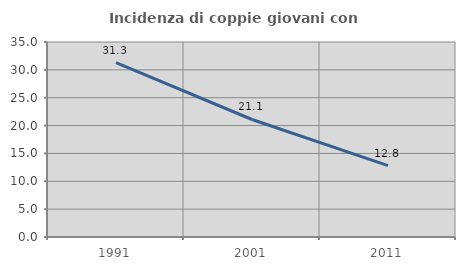
| Category | Incidenza di coppie giovani con figli |
|---|---|
| 1991.0 | 31.281 |
| 2001.0 | 21.09 |
| 2011.0 | 12.817 |